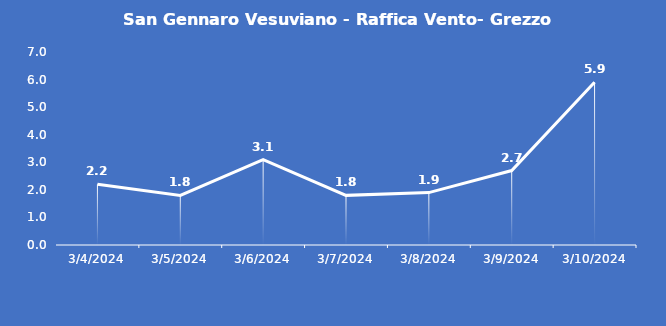
| Category | San Gennaro Vesuviano - Raffica Vento- Grezzo (m/s) |
|---|---|
| 3/4/24 | 2.2 |
| 3/5/24 | 1.8 |
| 3/6/24 | 3.1 |
| 3/7/24 | 1.8 |
| 3/8/24 | 1.9 |
| 3/9/24 | 2.7 |
| 3/10/24 | 5.9 |